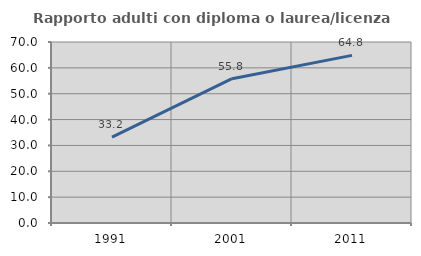
| Category | Rapporto adulti con diploma o laurea/licenza media  |
|---|---|
| 1991.0 | 33.237 |
| 2001.0 | 55.812 |
| 2011.0 | 64.82 |